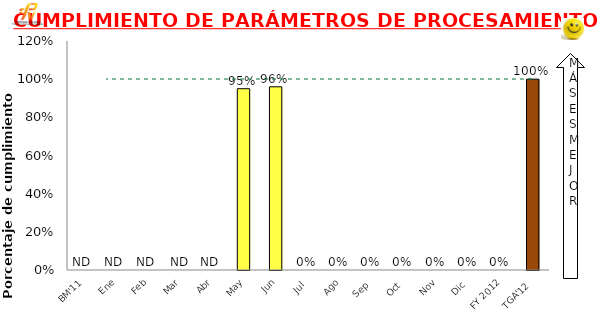
| Category | Mensual |
|---|---|
| BM'11 | 0 |
| Ene | 0 |
| Feb | 0 |
| Mar | 0 |
| Abr | 0 |
| May | 0.95 |
| Jun | 0.96 |
| Jul | 0 |
| Ago | 0 |
| Sep | 0 |
| Oct | 0 |
| Nov | 0 |
| Dic | 0 |
| FY 2012 | 0 |
| TGA'12 | 1 |